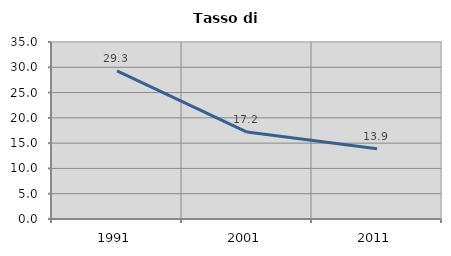
| Category | Tasso di disoccupazione   |
|---|---|
| 1991.0 | 29.289 |
| 2001.0 | 17.185 |
| 2011.0 | 13.883 |